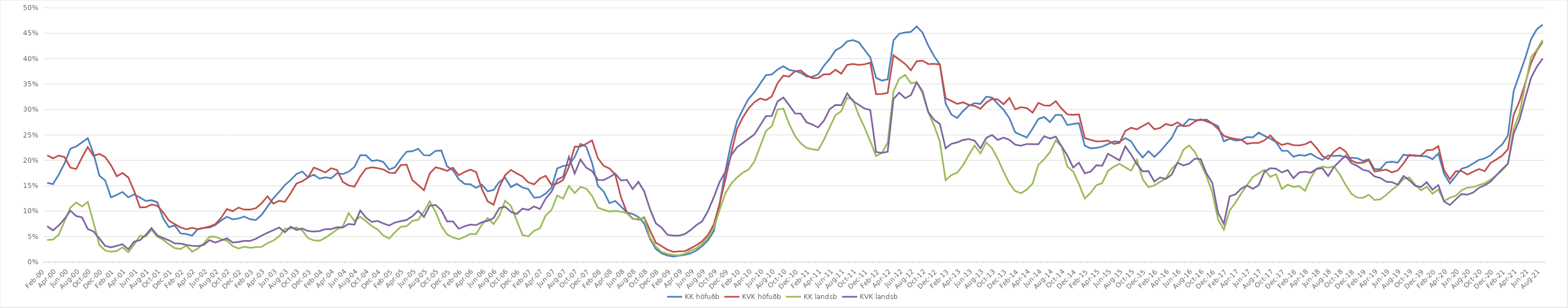
| Category | KK höfuðb | KVK höfuðb | KK landsb | KVK landsb |
|---|---|---|---|---|
| Feb-00 | 0.156 | 0.21 | 0.043 | 0.07 |
| Mar-00 | 0.153 | 0.204 | 0.044 | 0.062 |
| Apr-00 | 0.172 | 0.209 | 0.054 | 0.072 |
| May-00 | 0.194 | 0.206 | 0.081 | 0.085 |
| Jun-00 | 0.223 | 0.186 | 0.107 | 0.101 |
| Jul-00 | 0.227 | 0.183 | 0.117 | 0.09 |
| Aug-00 | 0.235 | 0.205 | 0.109 | 0.088 |
| Sep-00 | 0.244 | 0.226 | 0.118 | 0.065 |
| Oct-00 | 0.213 | 0.209 | 0.077 | 0.06 |
| Nov-00 | 0.17 | 0.213 | 0.033 | 0.046 |
| Dec-00 | 0.16 | 0.206 | 0.023 | 0.032 |
| Jan-01 | 0.127 | 0.191 | 0.02 | 0.029 |
| Feb-01 | 0.132 | 0.169 | 0.022 | 0.032 |
| Mar-01 | 0.138 | 0.175 | 0.029 | 0.035 |
| Apr-01 | 0.127 | 0.166 | 0.019 | 0.025 |
| May-01 | 0.133 | 0.14 | 0.034 | 0.04 |
| Jun-01 | 0.127 | 0.107 | 0.051 | 0.043 |
| Jul-01 | 0.12 | 0.108 | 0.05 | 0.053 |
| Aug-01 | 0.122 | 0.113 | 0.063 | 0.067 |
| Sep-01 | 0.118 | 0.111 | 0.05 | 0.052 |
| Oct-01 | 0.086 | 0.098 | 0.044 | 0.047 |
| Nov-01 | 0.068 | 0.081 | 0.035 | 0.043 |
| Dec-01 | 0.072 | 0.074 | 0.027 | 0.037 |
| Jan-02 | 0.056 | 0.068 | 0.026 | 0.036 |
| Feb-02 | 0.055 | 0.064 | 0.032 | 0.034 |
| Mar-02 | 0.052 | 0.067 | 0.02 | 0.032 |
| Apr-02 | 0.065 | 0.064 | 0.026 | 0.031 |
| May-02 | 0.067 | 0.067 | 0.037 | 0.034 |
| Jun-02 | 0.068 | 0.07 | 0.05 | 0.043 |
| Jul-02 | 0.073 | 0.074 | 0.05 | 0.038 |
| Aug-02 | 0.082 | 0.087 | 0.045 | 0.042 |
| Sep-02 | 0.089 | 0.104 | 0.042 | 0.047 |
| Oct-02 | 0.084 | 0.1 | 0.031 | 0.038 |
| Nov-02 | 0.086 | 0.107 | 0.027 | 0.039 |
| Dec-02 | 0.089 | 0.103 | 0.03 | 0.042 |
| Jan-03 | 0.084 | 0.103 | 0.028 | 0.042 |
| Feb-03 | 0.083 | 0.106 | 0.029 | 0.046 |
| Mar-03 | 0.093 | 0.116 | 0.03 | 0.052 |
| Apr-03 | 0.109 | 0.129 | 0.037 | 0.058 |
| May-03 | 0.125 | 0.115 | 0.042 | 0.062 |
| Jun-03 | 0.138 | 0.12 | 0.05 | 0.068 |
| Jul-03 | 0.151 | 0.118 | 0.065 | 0.059 |
| Aug-03 | 0.161 | 0.135 | 0.066 | 0.069 |
| Sep-03 | 0.173 | 0.154 | 0.068 | 0.063 |
| Oct-03 | 0.178 | 0.159 | 0.062 | 0.066 |
| Nov-03 | 0.167 | 0.166 | 0.047 | 0.061 |
| Dec-03 | 0.172 | 0.186 | 0.043 | 0.06 |
| Jan-04 | 0.164 | 0.181 | 0.042 | 0.061 |
| Feb-04 | 0.167 | 0.176 | 0.048 | 0.064 |
| Mar-04 | 0.165 | 0.185 | 0.056 | 0.065 |
| Apr-04 | 0.175 | 0.181 | 0.064 | 0.068 |
| May-04 | 0.173 | 0.158 | 0.07 | 0.068 |
| Jun-04 | 0.178 | 0.151 | 0.096 | 0.075 |
| Jul-04 | 0.187 | 0.148 | 0.081 | 0.074 |
| Aug-04 | 0.21 | 0.168 | 0.089 | 0.101 |
| Sep-04 | 0.21 | 0.184 | 0.08 | 0.087 |
| Oct-04 | 0.199 | 0.186 | 0.071 | 0.079 |
| Nov-04 | 0.2 | 0.185 | 0.064 | 0.081 |
| Dec-04 | 0.197 | 0.182 | 0.052 | 0.076 |
| Jan-05 | 0.182 | 0.176 | 0.046 | 0.072 |
| Feb-05 | 0.187 | 0.175 | 0.059 | 0.078 |
| Mar-05 | 0.203 | 0.191 | 0.069 | 0.08 |
| Apr-05 | 0.217 | 0.191 | 0.07 | 0.083 |
| May-05 | 0.218 | 0.161 | 0.081 | 0.09 |
| Jun-05 | 0.223 | 0.151 | 0.083 | 0.101 |
| Jul-05 | 0.21 | 0.141 | 0.099 | 0.089 |
| Aug-05 | 0.21 | 0.174 | 0.119 | 0.111 |
| Sep-05 | 0.219 | 0.186 | 0.099 | 0.112 |
| Oct-05 | 0.219 | 0.184 | 0.071 | 0.102 |
| Nov-05 | 0.188 | 0.179 | 0.054 | 0.08 |
| Dec-05 | 0.181 | 0.185 | 0.048 | 0.08 |
| Jan-06 | 0.163 | 0.171 | 0.045 | 0.065 |
| Feb-06 | 0.154 | 0.177 | 0.049 | 0.07 |
| Mar-06 | 0.153 | 0.182 | 0.055 | 0.074 |
| Apr-06 | 0.146 | 0.177 | 0.055 | 0.072 |
| May-06 | 0.152 | 0.143 | 0.074 | 0.078 |
| Jun-06 | 0.139 | 0.119 | 0.087 | 0.081 |
| Jul-06 | 0.142 | 0.113 | 0.075 | 0.086 |
| Aug-06 | 0.158 | 0.147 | 0.091 | 0.106 |
| Sep-06 | 0.166 | 0.171 | 0.121 | 0.109 |
| Oct-06 | 0.147 | 0.181 | 0.11 | 0.099 |
| Nov-06 | 0.154 | 0.174 | 0.082 | 0.094 |
| Dec-06 | 0.147 | 0.168 | 0.053 | 0.105 |
| Jan-07 | 0.143 | 0.157 | 0.05 | 0.103 |
| Feb-07 | 0.127 | 0.153 | 0.061 | 0.109 |
| Mar-07 | 0.127 | 0.164 | 0.066 | 0.104 |
| Apr-07 | 0.135 | 0.169 | 0.092 | 0.125 |
| May-07 | 0.146 | 0.152 | 0.102 | 0.138 |
| Jun-07 | 0.184 | 0.155 | 0.131 | 0.162 |
| Jul-07 | 0.189 | 0.161 | 0.124 | 0.168 |
| Aug-07 | 0.191 | 0.187 | 0.15 | 0.207 |
| Sep-07 | 0.207 | 0.227 | 0.136 | 0.174 |
| Oct-07 | 0.232 | 0.227 | 0.148 | 0.202 |
| Nov-07 | 0.227 | 0.233 | 0.144 | 0.186 |
| Dec-07 | 0.195 | 0.239 | 0.13 | 0.179 |
| Jan-08 | 0.15 | 0.204 | 0.107 | 0.162 |
| Feb-08 | 0.139 | 0.189 | 0.103 | 0.161 |
| Mar-08 | 0.116 | 0.184 | 0.099 | 0.167 |
| Apr-08 | 0.12 | 0.172 | 0.101 | 0.174 |
| May-08 | 0.109 | 0.127 | 0.099 | 0.16 |
| Jun-08 | 0.098 | 0.098 | 0.096 | 0.162 |
| Jul-08 | 0.094 | 0.085 | 0.084 | 0.144 |
| Aug-08 | 0.089 | 0.083 | 0.085 | 0.158 |
| Sep-08 | 0.076 | 0.088 | 0.086 | 0.139 |
| Oct-08 | 0.045 | 0.062 | 0.048 | 0.104 |
| Nov-08 | 0.026 | 0.038 | 0.03 | 0.076 |
| Dec-08 | 0.017 | 0.031 | 0.02 | 0.068 |
| Jan-09 | 0.013 | 0.024 | 0.016 | 0.054 |
| Feb-09 | 0.011 | 0.02 | 0.014 | 0.052 |
| Mar-09 | 0.012 | 0.021 | 0.013 | 0.052 |
| Apr-09 | 0.014 | 0.021 | 0.016 | 0.055 |
| May-09 | 0.017 | 0.027 | 0.022 | 0.063 |
| Jun-09 | 0.023 | 0.033 | 0.027 | 0.073 |
| Jul-09 | 0.031 | 0.041 | 0.036 | 0.08 |
| Aug-09 | 0.043 | 0.053 | 0.048 | 0.1 |
| Sep-09 | 0.061 | 0.074 | 0.067 | 0.127 |
| Oct-09 | 0.114 | 0.115 | 0.102 | 0.157 |
| Nov-09 | 0.179 | 0.162 | 0.135 | 0.177 |
| Dec-09 | 0.234 | 0.213 | 0.154 | 0.21 |
| Jan-10 | 0.277 | 0.262 | 0.166 | 0.226 |
| Feb-10 | 0.3 | 0.284 | 0.176 | 0.234 |
| Mar-10 | 0.321 | 0.302 | 0.182 | 0.243 |
| Apr-10 | 0.334 | 0.315 | 0.198 | 0.251 |
| May-10 | 0.351 | 0.322 | 0.227 | 0.269 |
| Jun-10 | 0.368 | 0.319 | 0.258 | 0.287 |
| Jul-10 | 0.369 | 0.326 | 0.267 | 0.287 |
| Aug-10 | 0.379 | 0.352 | 0.3 | 0.316 |
| Sep-10 | 0.385 | 0.367 | 0.302 | 0.324 |
| Oct-10 | 0.378 | 0.365 | 0.272 | 0.309 |
| Nov-10 | 0.376 | 0.375 | 0.248 | 0.293 |
| Dec-10 | 0.372 | 0.377 | 0.233 | 0.292 |
| Jan-11 | 0.365 | 0.368 | 0.225 | 0.275 |
| Feb-11 | 0.365 | 0.362 | 0.222 | 0.271 |
| Mar-11 | 0.369 | 0.362 | 0.22 | 0.265 |
| Apr-11 | 0.386 | 0.369 | 0.24 | 0.278 |
| May-11 | 0.4 | 0.369 | 0.265 | 0.301 |
| Jun-11 | 0.417 | 0.378 | 0.289 | 0.309 |
| Jul-11 | 0.423 | 0.37 | 0.297 | 0.308 |
| Aug-11 | 0.434 | 0.388 | 0.323 | 0.332 |
| Sep-11 | 0.436 | 0.39 | 0.32 | 0.317 |
| Oct-11 | 0.432 | 0.388 | 0.289 | 0.309 |
| Nov-11 | 0.418 | 0.389 | 0.265 | 0.302 |
| Dec-11 | 0.402 | 0.392 | 0.238 | 0.299 |
| Jan-12 | 0.362 | 0.33 | 0.209 | 0.216 |
| Feb-12 | 0.357 | 0.331 | 0.215 | 0.215 |
| Mar-12 | 0.359 | 0.333 | 0.234 | 0.217 |
| Apr-12 | 0.436 | 0.407 | 0.336 | 0.321 |
| May-12 | 0.449 | 0.398 | 0.361 | 0.333 |
| Jun-12 | 0.451 | 0.39 | 0.368 | 0.322 |
| Jul-12 | 0.453 | 0.377 | 0.352 | 0.328 |
| Aug-12 | 0.463 | 0.395 | 0.354 | 0.354 |
| Sep-12 | 0.452 | 0.396 | 0.333 | 0.336 |
| Oct-12 | 0.426 | 0.389 | 0.294 | 0.295 |
| Nov-12 | 0.405 | 0.39 | 0.269 | 0.28 |
| Dec-12 | 0.388 | 0.389 | 0.237 | 0.272 |
| Jan-13 | 0.312 | 0.322 | 0.161 | 0.224 |
| Feb-13 | 0.29 | 0.317 | 0.171 | 0.233 |
| Mar-13 | 0.283 | 0.311 | 0.176 | 0.235 |
| Apr-13 | 0.297 | 0.314 | 0.19 | 0.24 |
| May-13 | 0.307 | 0.309 | 0.211 | 0.242 |
| Jun-13 | 0.313 | 0.307 | 0.229 | 0.239 |
| Jul-13 | 0.311 | 0.301 | 0.214 | 0.224 |
| Aug-13 | 0.325 | 0.314 | 0.235 | 0.244 |
| Sep-13 | 0.323 | 0.321 | 0.224 | 0.25 |
| Oct-13 | 0.311 | 0.32 | 0.203 | 0.24 |
| Nov-13 | 0.3 | 0.311 | 0.178 | 0.245 |
| Dec-13 | 0.283 | 0.323 | 0.155 | 0.24 |
| Jan-14 | 0.255 | 0.301 | 0.139 | 0.231 |
| Feb-14 | 0.25 | 0.305 | 0.135 | 0.229 |
| Mar-14 | 0.245 | 0.303 | 0.142 | 0.232 |
| Apr-14 | 0.262 | 0.294 | 0.154 | 0.232 |
| May-14 | 0.281 | 0.313 | 0.191 | 0.232 |
| Jun-14 | 0.285 | 0.308 | 0.202 | 0.248 |
| Jul-14 | 0.275 | 0.308 | 0.216 | 0.243 |
| Aug-14 | 0.289 | 0.316 | 0.239 | 0.247 |
| Sep-14 | 0.289 | 0.302 | 0.227 | 0.228 |
| Oct-14 | 0.269 | 0.291 | 0.188 | 0.209 |
| Nov-14 | 0.272 | 0.289 | 0.178 | 0.186 |
| Dec-14 | 0.273 | 0.29 | 0.153 | 0.195 |
| Jan-15 | 0.229 | 0.244 | 0.125 | 0.174 |
| Feb-15 | 0.224 | 0.24 | 0.136 | 0.178 |
| Mar-15 | 0.225 | 0.237 | 0.151 | 0.19 |
| Apr-15 | 0.227 | 0.238 | 0.155 | 0.189 |
| May-15 | 0.232 | 0.239 | 0.179 | 0.213 |
| Jun-15 | 0.237 | 0.232 | 0.188 | 0.206 |
| Jul-15 | 0.236 | 0.234 | 0.193 | 0.2 |
| Aug-15 | 0.244 | 0.258 | 0.186 | 0.228 |
| Sep-15 | 0.238 | 0.264 | 0.18 | 0.211 |
| Oct-15 | 0.219 | 0.261 | 0.201 | 0.192 |
| Nov-15 | 0.206 | 0.268 | 0.163 | 0.178 |
| Dec-15 | 0.218 | 0.274 | 0.147 | 0.179 |
| Jan-16 | 0.207 | 0.261 | 0.151 | 0.158 |
| Feb-16 | 0.218 | 0.264 | 0.158 | 0.166 |
| Mar-16 | 0.231 | 0.272 | 0.165 | 0.163 |
| Apr-16 | 0.244 | 0.269 | 0.183 | 0.172 |
| May-16 | 0.267 | 0.275 | 0.194 | 0.195 |
| Jun-16 | 0.269 | 0.267 | 0.22 | 0.19 |
| Jul-16 | 0.281 | 0.268 | 0.229 | 0.193 |
| Aug-16 | 0.28 | 0.276 | 0.217 | 0.203 |
| Sep-16 | 0.279 | 0.281 | 0.193 | 0.202 |
| Oct-16 | 0.28 | 0.277 | 0.169 | 0.174 |
| Nov-16 | 0.273 | 0.272 | 0.137 | 0.156 |
| Dec-16 | 0.267 | 0.262 | 0.084 | 0.097 |
| Jan-17 | 0.237 | 0.248 | 0.064 | 0.075 |
| Feb-17 | 0.243 | 0.244 | 0.101 | 0.129 |
| Mar-17 | 0.239 | 0.242 | 0.117 | 0.133 |
| Apr-17 | 0.24 | 0.241 | 0.135 | 0.144 |
| May-17 | 0.246 | 0.233 | 0.151 | 0.151 |
| Jun-17 | 0.245 | 0.234 | 0.167 | 0.144 |
| Jul-17 | 0.255 | 0.234 | 0.174 | 0.151 |
| Aug-17 | 0.248 | 0.239 | 0.181 | 0.177 |
| Sep-17 | 0.243 | 0.249 | 0.168 | 0.184 |
| Oct-17 | 0.236 | 0.237 | 0.173 | 0.183 |
| Nov-17 | 0.219 | 0.23 | 0.144 | 0.176 |
| Dec-17 | 0.219 | 0.233 | 0.152 | 0.181 |
| Jan-18 | 0.207 | 0.23 | 0.148 | 0.165 |
| Feb-18 | 0.21 | 0.229 | 0.149 | 0.176 |
| Mar-18 | 0.209 | 0.232 | 0.14 | 0.178 |
| Apr-18 | 0.213 | 0.237 | 0.166 | 0.176 |
| May-18 | 0.206 | 0.224 | 0.184 | 0.183 |
| Jun-18 | 0.201 | 0.209 | 0.188 | 0.185 |
| Jul-18 | 0.21 | 0.202 | 0.186 | 0.169 |
| Aug-18 | 0.209 | 0.217 | 0.188 | 0.187 |
| Sep-18 | 0.21 | 0.225 | 0.172 | 0.199 |
| Oct-18 | 0.206 | 0.217 | 0.152 | 0.209 |
| Nov-18 | 0.205 | 0.199 | 0.134 | 0.194 |
| Dec-18 | 0.204 | 0.195 | 0.127 | 0.189 |
| Jan-19 | 0.199 | 0.195 | 0.126 | 0.181 |
| Feb-19 | 0.202 | 0.2 | 0.132 | 0.179 |
| Mar-19 | 0.182 | 0.178 | 0.122 | 0.168 |
| Apr-19 | 0.183 | 0.18 | 0.123 | 0.165 |
| May-19 | 0.196 | 0.182 | 0.132 | 0.158 |
| Jun-19 | 0.197 | 0.176 | 0.142 | 0.157 |
| Jul-19 | 0.195 | 0.18 | 0.151 | 0.152 |
| Aug-19 | 0.211 | 0.194 | 0.163 | 0.169 |
| Sep-19 | 0.209 | 0.211 | 0.167 | 0.161 |
| Oct-19 | 0.21 | 0.209 | 0.152 | 0.15 |
| Nov-19 | 0.208 | 0.209 | 0.141 | 0.147 |
| Dec-19 | 0.208 | 0.22 | 0.148 | 0.157 |
| Jan-20 | 0.202 | 0.221 | 0.134 | 0.142 |
| Feb-20 | 0.213 | 0.228 | 0.143 | 0.151 |
| mars.20* | 0.173 | 0.18 | 0.12 | 0.119 |
| Apr-20 | 0.155 | 0.163 | 0.126 | 0.112 |
| May-20 | 0.169 | 0.178 | 0.13 | 0.123 |
| Jun-20 | 0.183 | 0.179 | 0.141 | 0.134 |
| Jul-20 | 0.187 | 0.172 | 0.146 | 0.132 |
| Aug-20 | 0.194 | 0.178 | 0.147 | 0.137 |
| Sep-20 | 0.201 | 0.183 | 0.151 | 0.146 |
| Oct-20 | 0.204 | 0.179 | 0.155 | 0.151 |
| Nov-20 | 0.21 | 0.195 | 0.162 | 0.158 |
| Dec-20 | 0.221 | 0.202 | 0.171 | 0.17 |
| Jan-21 | 0.231 | 0.209 | 0.18 | 0.183 |
| Feb-21 | 0.248 | 0.222 | 0.193 | 0.193 |
| Mar-21 | 0.337 | 0.29 | 0.262 | 0.253 |
| Apr-21 | 0.369 | 0.316 | 0.292 | 0.279 |
| May-21 | 0.402 | 0.352 | 0.349 | 0.323 |
| Jun-21 | 0.438 | 0.392 | 0.403 | 0.362 |
| Jul-21 | 0.458 | 0.416 | 0.418 | 0.384 |
| Aug-21 | 0.467 | 0.433 | 0.437 | 0.4 |